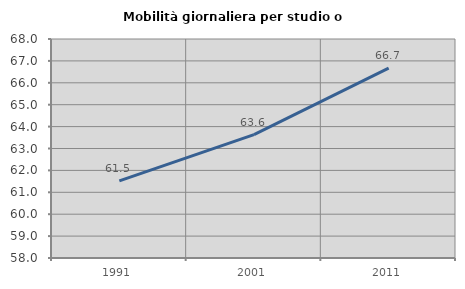
| Category | Mobilità giornaliera per studio o lavoro |
|---|---|
| 1991.0 | 61.523 |
| 2001.0 | 63.636 |
| 2011.0 | 66.667 |